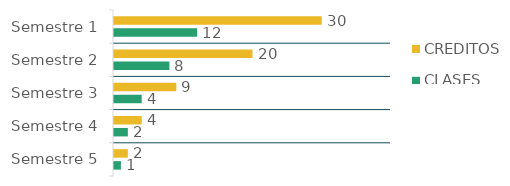
| Category | CRÉDITOS  | CLASES  |
|---|---|---|
| Semestre 1 | 30 | 12 |
| Semestre 2 | 20 | 8 |
| Semestre 3 | 9 | 4 |
| Semestre 4 | 4 | 2 |
| Semestre 5 | 2 | 1 |